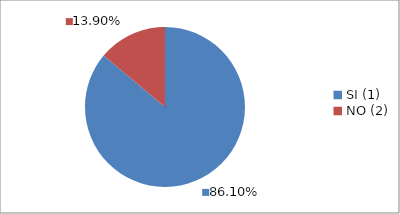
| Category | Series 0 |
|---|---|
| SI (1) | 0.861 |
| NO (2) | 0.139 |